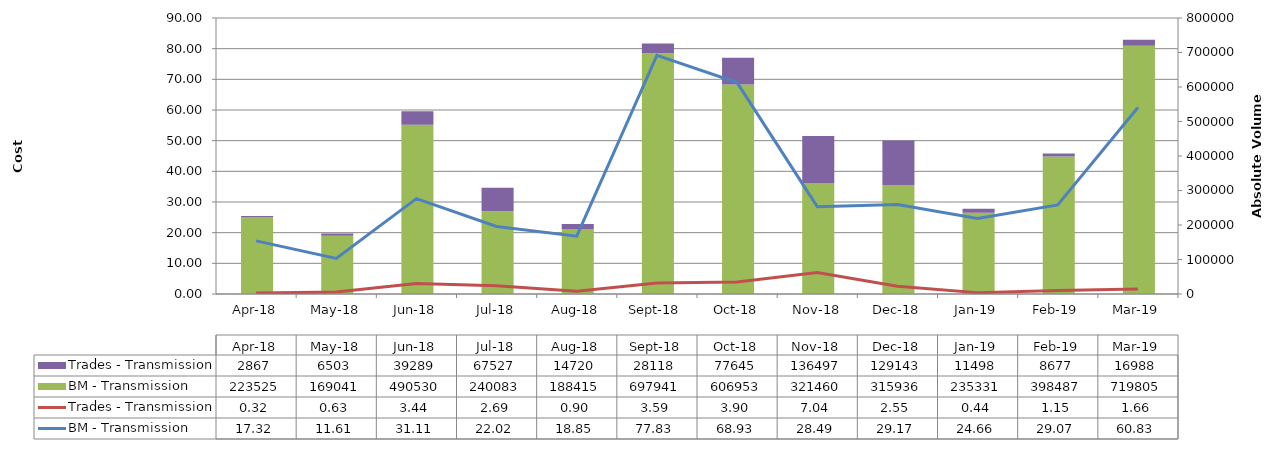
| Category | BM - Transmission | Trades - Transmission |
|---|---|---|
| 2018-04-01 | 223524.634 | 2867 |
| 2018-05-01 | 169041.237 | 6502.5 |
| 2018-06-01 | 490529.9 | 39289.4 |
| 2018-07-01 | 240083.216 | 67527 |
| 2018-08-01 | 188414.662 | 14720.2 |
| 2018-09-01 | 697941.339 | 28117.6 |
| 2018-10-01 | 606952.947 | 77645 |
| 2018-11-01 | 321460.438 | 136496.9 |
| 2018-12-01 | 315936.421 | 129143.4 |
| 2019-01-01 | 235331.037 | 11498.2 |
| 2019-02-01 | 398487.321 | 8676.9 |
| 2019-03-01 | 719804.989 | 16987.7 |